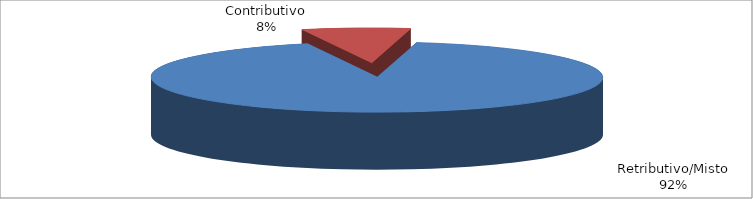
| Category | Decorrenti ANNO 2022 |
|---|---|
| Retributivo/Misto | 302148 |
| Contributivo | 25410 |